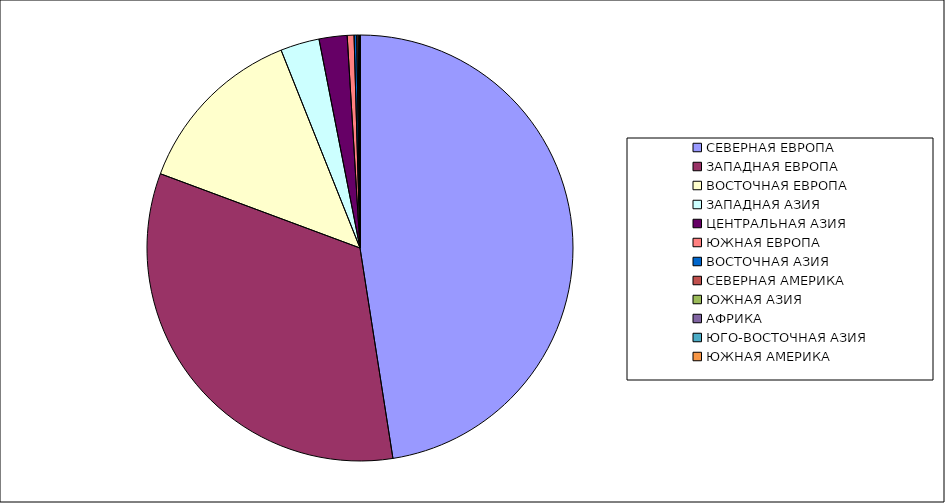
| Category | Оборот |
|---|---|
| СЕВЕРНАЯ ЕВРОПА | 47.528 |
| ЗАПАДНАЯ ЕВРОПА | 33.14 |
| ВОСТОЧНАЯ ЕВРОПА | 13.292 |
| ЗАПАДНАЯ АЗИЯ | 2.953 |
| ЦЕНТРАЛЬНАЯ АЗИЯ | 2.126 |
| ЮЖНАЯ ЕВРОПА | 0.515 |
| ВОСТОЧНАЯ АЗИЯ | 0.199 |
| СЕВЕРНАЯ АМЕРИКА | 0.113 |
| ЮЖНАЯ АЗИЯ | 0.09 |
| АФРИКА | 0.042 |
| ЮГО-ВОСТОЧНАЯ АЗИЯ | 0.001 |
| ЮЖНАЯ АМЕРИКА | 0.001 |